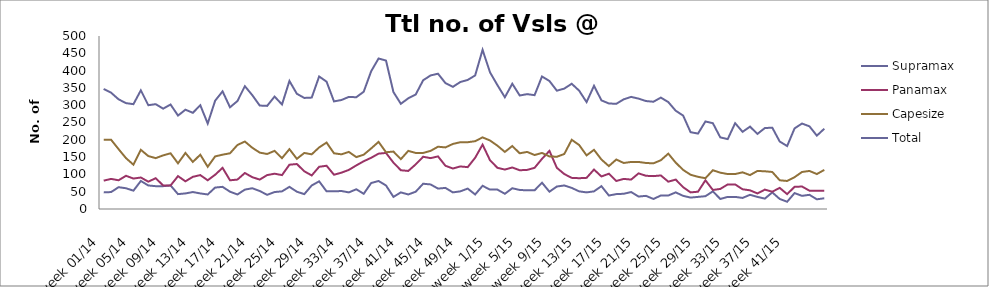
| Category | Supramax | Panamax | Capesize | Total |
|---|---|---|---|---|
| week 01/14 | 48 | 82 | 200 | 347 |
| week 02/14 | 49 | 87 | 200 | 336 |
| week 03/14 | 63 | 83 | 173 | 317 |
| week 04/14 | 60 | 96 | 147 | 306 |
| week 05/14 | 53 | 88 | 128 | 303 |
| week 06/14 | 81 | 91 | 171 | 343 |
| week 07/14 | 68 | 79 | 153 | 300 |
| week 08/14 | 66 | 89 | 147 | 303 |
| week 09/14 | 66 | 68 | 155 | 290 |
| week 10/14 | 68 | 68 | 161 | 302 |
| week 11/14 | 43 | 95 | 132 | 270 |
| week 12/14 | 45 | 80 | 162 | 287 |
| week 13/14 | 49 | 93 | 136 | 278 |
| week 14/14 | 45 | 98 | 157 | 300 |
| week 15/14 | 42 | 83 | 122 | 247 |
| week 16/14 | 62 | 99 | 152 | 313 |
| week 17/14 | 64 | 119 | 157 | 340 |
| week 18/14 | 50 | 83 | 161 | 294 |
| week 19/14 | 42 | 85 | 185 | 312 |
| week 20/14 | 56 | 104 | 195 | 355 |
| week 21/14 | 60 | 92 | 177 | 329 |
| week 22/14 | 52 | 85 | 163 | 299 |
| week 23/14 | 41 | 98 | 159 | 298 |
| week 24/14 | 49 | 102 | 168 | 325 |
| week 25/14 | 51 | 98 | 147 | 302 |
| week 26/14 | 64 | 128 | 173 | 370 |
| week 27/14 | 50 | 130 | 145 | 333 |
| week 28/14 | 43 | 109 | 162 | 321 |
| week 29/14 | 68 | 97 | 158 | 322 |
| week 30/14 | 80 | 122 | 178 | 383 |
| week 31/14 | 51 | 125 | 192 | 368 |
| week 32/14 | 51 | 99 | 161 | 311 |
| week 33/14 | 52 | 105 | 158 | 315 |
| week 34/14 | 48 | 113 | 165 | 324 |
| week 35/14 | 57 | 126 | 150 | 323 |
| week 36/14 | 44 | 138 | 157 | 339 |
| week 37/14 | 75 | 148 | 175 | 398 |
| week 38/14 | 81 | 160 | 194 | 435 |
| week 39/14 | 68 | 162 | 164 | 429 |
| week 40/14 | 35 | 134 | 166 | 338 |
| week 41/14 | 48 | 112 | 144 | 304 |
| week 42/14 | 42 | 110 | 168 | 320 |
| week 43/14 | 50 | 129 | 162 | 331 |
| week 44/14 | 73 | 151 | 162 | 372 |
| week 45/14 | 71 | 147 | 168 | 386 |
| week 46/14 | 59 | 152 | 180 | 391 |
| week 47/14 | 61 | 125 | 178 | 364 |
| week 48/14 | 48 | 117 | 188 | 353 |
| week 49/14 | 51 | 123 | 193 | 367 |
| week 50/14 | 59 | 121 | 193 | 373 |
| week 51/14 | 42 | 148 | 196 | 386 |
| week 52/14 | 67 | 186 | 207 | 460 |
| week 1/15 | 56 | 141 | 198 | 395 |
| week 2/15 | 56 | 119 | 183 | 358 |
| week 3/15 | 44 | 114 | 165 | 323 |
| week 4/15 | 60 | 120 | 182 | 362 |
| week 5/15 | 55 | 112 | 161 | 328 |
| week 6/15 | 54 | 113 | 165 | 332 |
| week 7/15 | 54 | 119 | 156 | 329 |
| week 8/15 | 76 | 145 | 162 | 383 |
| week 9/15 | 50 | 168 | 152 | 370 |
| week 10/15 | 65 | 119 | 151 | 342 |
| week 11/15 | 68 | 101 | 159 | 348 |
| week 12/15 | 61 | 90 | 200 | 362 |
| week 13/15 | 51 | 89 | 185 | 342 |
| week 14/15 | 48 | 90 | 155 | 309 |
| week 15/15 | 51 | 114 | 171 | 356 |
| week 16/15 | 66 | 94 | 143 | 314 |
| week 17/15 | 39 | 102 | 124 | 305 |
| week 18/15 | 43 | 81 | 143 | 304 |
| week 19/15 | 44 | 87 | 133 | 317 |
| week 20/15 | 49 | 85 | 136 | 324 |
| week 21/15 | 36 | 103 | 136 | 319 |
| week 22/15 | 38 | 96 | 133 | 312 |
| week 23/15 | 29 | 95 | 132 | 310 |
| week 24/15 | 39 | 97 | 141 | 322 |
| week 25/15 | 39 | 79 | 160 | 309 |
| week 26/15 | 48 | 85 | 134 | 284 |
| week 27/15 | 38 | 63 | 113 | 270 |
| week 28/15 | 33 | 48 | 99 | 222 |
| week 29/15 | 35 | 50 | 93 | 218 |
| week 30/15 | 37 | 83 | 89 | 253 |
| week 31/15 | 51 | 55 | 112 | 248 |
| week 32/15 | 29 | 58 | 105 | 207 |
| week 33/15 | 35 | 71 | 101 | 202 |
| week 34/15 | 35 | 71 | 101 | 248 |
| week 35/15 | 32 | 57 | 106 | 223 |
| week 36/15 | 41 | 54 | 98 | 238 |
| week 37/15 | 35 | 45 | 110 | 217 |
| week 38/15 | 30 | 56 | 109 | 234 |
| week 39/15 | 48 | 50 | 107 | 235 |
| week 40/15 | 29 | 61 | 83 | 195 |
| week 41/15 | 21 | 43 | 81 | 182 |
| week 42/15 | 46 | 64 | 92 | 233 |